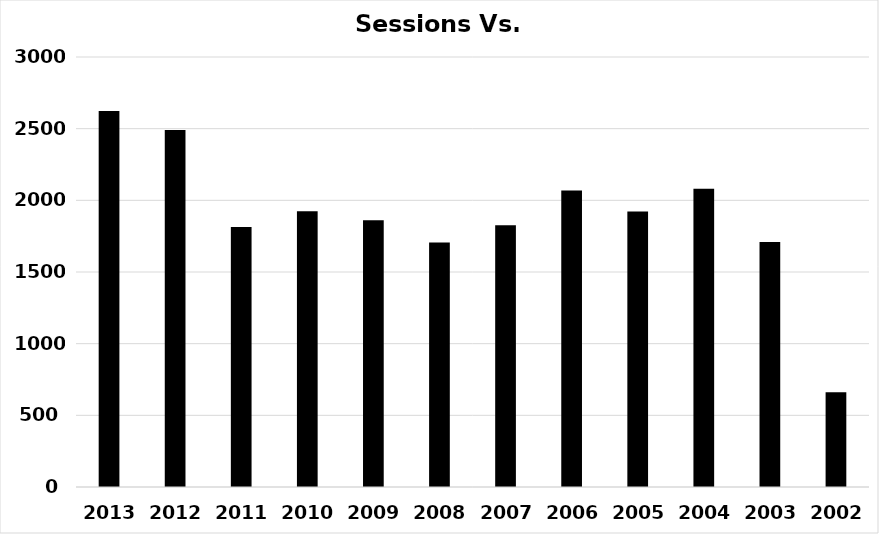
| Category | Series 0 |
|---|---|
| 2013.0 | 2623 |
| 2012.0 | 2490 |
| 2011.0 | 1814 |
| 2010.0 | 1924 |
| 2009.0 | 1861 |
| 2008.0 | 1706 |
| 2007.0 | 1827 |
| 2006.0 | 2069 |
| 2005.0 | 1922 |
| 2004.0 | 2080 |
| 2003.0 | 1709 |
| 2002.0 | 661 |